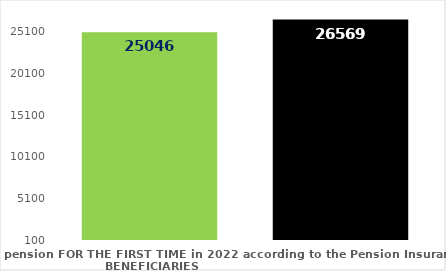
| Category | broj korisnika |
|---|---|
| Pension beneficiaries entitled to pension FOR THE FIRST TIME in 2022 according to the Pension Insurance Act  - NEW BENEFICIARIES | 25046 |
| Pension beneficiaries whose pension entitlement ceased in 2022  -  death caused,   
and who were retired according to the Pension Insurance Act   | 26569 |